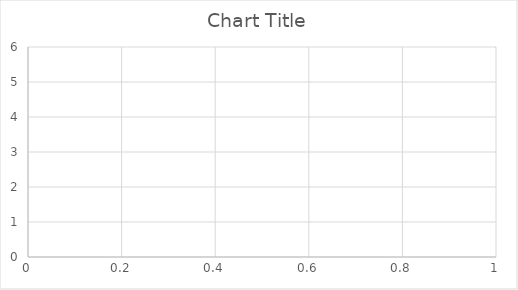
| Category | Series 0 |
|---|---|
| 0 | 6 |
| 1 | 3.5 |
| 2 | 4 |
| 3 | 4.25 |
| 4 | 4.2 |
| 5 | 4.5 |
| 6 | 4 |
| 7 | 4.25 |
| 8 | 4.444 |
| 9 | 4.5 |
| 10 | 4.273 |
| 11 | 4.417 |
| 12 | 4.385 |
| 13 | 4.357 |
| 14 | 4.267 |
| 15 | 4.062 |
| 16 | 4 |
| 17 | 3.889 |
| 18 | 3.947 |
| 19 | 3.85 |
| 20 | 3.857 |
| 21 | 3.955 |
| 22 | 3.826 |
| 23 | 3.833 |
| 24 | 3.76 |
| 25 | 3.846 |
| 26 | 3.815 |
| 27 | 3.714 |
| 28 | 3.621 |
| 29 | 3.633 |
| 30 | 3.581 |
| 31 | 3.625 |
| 32 | 3.636 |
| 33 | 3.559 |
| 34 | 3.514 |
| 35 | 3.5 |
| 36 | 3.432 |
| 37 | 3.395 |
| 38 | 3.462 |
| 39 | 3.5 |
| 40 | 3.439 |
| 41 | 3.429 |
| 42 | 3.395 |
| 43 | 3.386 |
| 44 | 3.4 |
| 45 | 3.413 |
| 46 | 3.468 |
| 47 | 3.521 |
| 48 | 3.571 |
| 49 | 3.52 |
| 50 | 3.471 |
| 51 | 3.423 |
| 52 | 3.434 |
| 53 | 3.463 |
| 54 | 3.418 |
| 55 | 3.429 |
| 56 | 3.474 |
| 57 | 3.517 |
| 58 | 3.525 |
| 59 | 3.55 |
| 60 | 3.541 |
| 61 | 3.565 |
| 62 | 3.587 |
| 63 | 3.594 |
| 64 | 3.569 |
| 65 | 3.545 |
| 66 | 3.567 |
| 67 | 3.544 |
| 68 | 3.565 |
| 69 | 3.557 |
| 70 | 3.592 |
| 71 | 3.625 |
| 72 | 3.644 |
| 73 | 3.662 |
| 74 | 3.64 |
| 75 | 3.632 |
| 76 | 3.662 |
| 77 | 3.667 |
| 78 | 3.696 |
| 79 | 3.675 |
| 80 | 3.654 |
| 81 | 3.646 |
| 82 | 3.639 |
| 83 | 3.667 |
| 84 | 3.647 |
| 85 | 3.628 |
| 86 | 3.609 |
| 87 | 3.58 |
| 88 | 3.551 |
| 89 | 3.544 |
| 90 | 3.56 |
| 91 | 3.554 |
| 92 | 3.559 |
| 93 | 3.585 |
| 94 | 3.611 |
| 95 | 3.583 |
| 96 | 3.608 |
| 97 | 3.602 |
| 98 | 3.626 |
| 99 | 3.65 |
| 100 | 3.653 |
| 101 | 3.657 |
| 102 | 3.631 |
| 103 | 3.625 |
| 104 | 3.619 |
| 105 | 3.594 |
| 106 | 3.579 |
| 107 | 3.593 |
| 108 | 3.596 |
| 109 | 3.609 |
| 110 | 3.586 |
| 111 | 3.58 |
| 112 | 3.558 |
| 113 | 3.544 |
| 114 | 3.557 |
| 115 | 3.552 |
| 116 | 3.556 |
| 117 | 3.534 |
| 118 | 3.546 |
| 119 | 3.567 |
| 120 | 3.554 |
| 121 | 3.549 |
| 122 | 3.553 |
| 123 | 3.556 |
| 124 | 3.536 |
| 125 | 3.556 |
| 126 | 3.535 |
| 127 | 3.547 |
| 128 | 3.543 |
| 129 | 3.538 |
| 130 | 3.557 |
| 131 | 3.553 |
| 132 | 3.556 |
| 133 | 3.545 |
| 134 | 3.526 |
| 135 | 3.537 |
| 136 | 3.555 |
| 137 | 3.565 |
| 138 | 3.568 |
| 139 | 3.571 |
| 140 | 3.589 |
| 141 | 3.585 |
| 142 | 3.587 |
| 143 | 3.569 |
| 144 | 3.572 |
| 145 | 3.562 |
| 146 | 3.544 |
| 147 | 3.541 |
| 148 | 3.523 |
| 149 | 3.527 |
| 150 | 3.51 |
| 151 | 3.52 |
| 152 | 3.523 |
| 153 | 3.526 |
| 154 | 3.51 |
| 155 | 3.494 |
| 156 | 3.484 |
| 157 | 3.5 |
| 158 | 3.491 |
| 159 | 3.475 |
| 160 | 3.466 |
| 161 | 3.463 |
| 162 | 3.448 |
| 163 | 3.457 |
| 164 | 3.442 |
| 165 | 3.428 |
| 166 | 3.419 |
| 167 | 3.405 |
| 168 | 3.414 |
| 169 | 3.418 |
| 170 | 3.427 |
| 171 | 3.413 |
| 172 | 3.416 |
| 173 | 3.431 |
| 174 | 3.446 |
| 175 | 3.432 |
| 176 | 3.441 |
| 177 | 3.444 |
| 178 | 3.458 |
| 179 | 3.444 |
| 180 | 3.453 |
| 181 | 3.456 |
| 182 | 3.448 |
| 183 | 3.462 |
| 184 | 3.47 |
| 185 | 3.462 |
| 186 | 3.471 |
| 187 | 3.463 |
| 188 | 3.45 |
| 189 | 3.463 |
| 190 | 3.461 |
| 191 | 3.464 |
| 192 | 3.477 |
| 193 | 3.464 |
| 194 | 3.462 |
| 195 | 3.469 |
| 196 | 3.462 |
| 197 | 3.455 |
| 198 | 3.447 |
| 199 | 3.435 |
| 200 | 3.443 |
| 201 | 3.45 |
| 202 | 3.443 |
| 203 | 3.431 |
| 204 | 3.424 |
| 205 | 3.422 |
| 206 | 3.42 |
| 207 | 3.423 |
| 208 | 3.431 |
| 209 | 3.443 |
| 210 | 3.436 |
| 211 | 3.439 |
| 212 | 3.427 |
| 213 | 3.421 |
| 214 | 3.414 |
| 215 | 3.421 |
| 216 | 3.424 |
| 217 | 3.422 |
| 218 | 3.429 |
| 219 | 3.427 |
| 220 | 3.434 |
| 221 | 3.441 |
| 222 | 3.444 |
| 223 | 3.446 |
| 224 | 3.449 |
| 225 | 3.442 |
| 226 | 3.449 |
| 227 | 3.443 |
| 228 | 3.454 |
| 229 | 3.457 |
| 230 | 3.45 |
| 231 | 3.461 |
| 232 | 3.455 |
| 233 | 3.466 |
| 234 | 3.46 |
| 235 | 3.458 |
| 236 | 3.46 |
| 237 | 3.466 |
| 238 | 3.464 |
| 239 | 3.467 |
| 240 | 3.461 |
| 241 | 3.455 |
| 242 | 3.444 |
| 243 | 3.443 |
| 244 | 3.441 |
| 245 | 3.435 |
| 246 | 3.441 |
| 247 | 3.44 |
| 248 | 3.446 |
| 249 | 3.44 |
| 250 | 3.442 |
| 251 | 3.437 |
| 252 | 3.435 |
| 253 | 3.429 |
| 254 | 3.439 |
| 255 | 3.449 |
| 256 | 3.459 |
| 257 | 3.453 |
| 258 | 3.463 |
| 259 | 3.454 |
| 260 | 3.456 |
| 261 | 3.45 |
| 262 | 3.441 |
| 263 | 3.436 |
| 264 | 3.43 |
| 265 | 3.429 |
| 266 | 3.434 |
| 267 | 3.433 |
| 268 | 3.442 |
| 269 | 3.437 |
| 270 | 3.439 |
| 271 | 3.43 |
| 272 | 3.44 |
| 273 | 3.434 |
| 274 | 3.425 |
| 275 | 3.417 |
| 276 | 3.422 |
| 277 | 3.417 |
| 278 | 3.419 |
| 279 | 3.421 |
| 280 | 3.42 |
| 281 | 3.429 |
| 282 | 3.435 |
| 283 | 3.43 |
| 284 | 3.425 |
| 285 | 3.434 |
| 286 | 3.436 |
| 287 | 3.444 |
| 288 | 3.453 |
| 289 | 3.455 |
| 290 | 3.464 |
| 291 | 3.473 |
| 292 | 3.471 |
| 293 | 3.476 |
| 294 | 3.478 |
| 295 | 3.473 |
| 296 | 3.468 |
| 297 | 3.47 |
| 298 | 3.472 |
| 299 | 3.47 |
| 300 | 3.465 |
| 301 | 3.474 |
| 302 | 3.475 |
| 303 | 3.477 |
| 304 | 3.472 |
| 305 | 3.477 |
| 306 | 3.485 |
| 307 | 3.494 |
| 308 | 3.492 |
| 309 | 3.484 |
| 310 | 3.482 |
| 311 | 3.481 |
| 312 | 3.479 |
| 313 | 3.478 |
| 314 | 3.476 |
| 315 | 3.475 |
| 316 | 3.47 |
| 317 | 3.462 |
| 318 | 3.461 |
| 319 | 3.466 |
| 320 | 3.47 |
| 321 | 3.463 |
| 322 | 3.471 |
| 323 | 3.466 |
| 324 | 3.465 |
| 325 | 3.469 |
| 326 | 3.474 |
| 327 | 3.482 |
| 328 | 3.486 |
| 329 | 3.485 |
| 330 | 3.486 |
| 331 | 3.482 |
| 332 | 3.477 |
| 333 | 3.476 |
| 334 | 3.481 |
| 335 | 3.482 |
| 336 | 3.49 |
| 337 | 3.497 |
| 338 | 3.496 |
| 339 | 3.5 |
| 340 | 3.496 |
| 341 | 3.503 |
| 342 | 3.51 |
| 343 | 3.509 |
| 344 | 3.504 |
| 345 | 3.512 |
| 346 | 3.516 |
| 347 | 3.52 |
| 348 | 3.527 |
| 349 | 3.531 |
| 350 | 3.527 |
| 351 | 3.528 |
| 352 | 3.527 |
| 353 | 3.534 |
| 354 | 3.532 |
| 355 | 3.531 |
| 356 | 3.527 |
| 357 | 3.528 |
| 358 | 3.532 |
| 359 | 3.539 |
| 360 | 3.535 |
| 361 | 3.536 |
| 362 | 3.529 |
| 363 | 3.522 |
| 364 | 3.521 |
| 365 | 3.525 |
| 366 | 3.529 |
| 367 | 3.533 |
| 368 | 3.528 |
| 369 | 3.53 |
| 370 | 3.526 |
| 371 | 3.53 |
| 372 | 3.531 |
| 373 | 3.532 |
| 374 | 3.525 |
| 375 | 3.529 |
| 376 | 3.523 |
| 377 | 3.526 |
| 378 | 3.528 |
| 379 | 3.526 |
| 380 | 3.533 |
| 381 | 3.539 |
| 382 | 3.538 |
| 383 | 3.539 |
| 384 | 3.545 |
| 385 | 3.539 |
| 386 | 3.545 |
| 387 | 3.544 |
| 388 | 3.542 |
| 389 | 3.541 |
| 390 | 3.545 |
| 391 | 3.538 |
| 392 | 3.545 |
| 393 | 3.551 |
| 394 | 3.554 |
| 395 | 3.553 |
| 396 | 3.557 |
| 397 | 3.555 |
| 398 | 3.559 |
| 399 | 3.555 |
| 400 | 3.554 |
| 401 | 3.55 |
| 402 | 3.553 |
| 403 | 3.547 |
| 404 | 3.541 |
| 405 | 3.537 |
| 406 | 3.531 |
| 407 | 3.527 |
| 408 | 3.523 |
| 409 | 3.52 |
| 410 | 3.523 |
| 411 | 3.529 |
| 412 | 3.523 |
| 413 | 3.524 |
| 414 | 3.528 |
| 415 | 3.529 |
| 416 | 3.53 |
| 417 | 3.524 |
| 418 | 3.525 |
| 419 | 3.521 |
| 420 | 3.515 |
| 421 | 3.509 |
| 422 | 3.506 |
| 423 | 3.5 |
| 424 | 3.501 |
| 425 | 3.505 |
| 426 | 3.508 |
| 427 | 3.507 |
| 428 | 3.513 |
| 429 | 3.509 |
| 430 | 3.515 |
| 431 | 3.519 |
| 432 | 3.522 |
| 433 | 3.518 |
| 434 | 3.515 |
| 435 | 3.509 |
| 436 | 3.508 |
| 437 | 3.505 |
| 438 | 3.503 |
| 439 | 3.507 |
| 440 | 3.51 |
| 441 | 3.507 |
| 442 | 3.506 |
| 443 | 3.505 |
| 444 | 3.503 |
| 445 | 3.509 |
| 446 | 3.512 |
| 447 | 3.516 |
| 448 | 3.521 |
| 449 | 3.527 |
| 450 | 3.523 |
| 451 | 3.529 |
| 452 | 3.532 |
| 453 | 3.537 |
| 454 | 3.541 |
| 455 | 3.542 |
| 456 | 3.536 |
| 457 | 3.531 |
| 458 | 3.525 |
| 459 | 3.52 |
| 460 | 3.516 |
| 461 | 3.511 |
| 462 | 3.505 |
| 463 | 3.502 |
| 464 | 3.505 |
| 465 | 3.502 |
| 466 | 3.497 |
| 467 | 3.494 |
| 468 | 3.495 |
| 469 | 3.489 |
| 470 | 3.49 |
| 471 | 3.494 |
| 472 | 3.497 |
| 473 | 3.5 |
| 474 | 3.503 |
| 475 | 3.508 |
| 476 | 3.512 |
| 477 | 3.517 |
| 478 | 3.511 |
| 479 | 3.51 |
| 480 | 3.514 |
| 481 | 3.517 |
| 482 | 3.518 |
| 483 | 3.523 |
| 484 | 3.522 |
| 485 | 3.516 |
| 486 | 3.511 |
| 487 | 3.506 |
| 488 | 3.511 |
| 489 | 3.506 |
| 490 | 3.511 |
| 491 | 3.514 |
| 492 | 3.511 |
| 493 | 3.506 |
| 494 | 3.509 |
| 495 | 3.512 |
| 496 | 3.511 |
| 497 | 3.514 |
| 498 | 3.511 |
| 499 | 3.51 |
| 500 | 3.509 |
| 501 | 3.512 |
| 502 | 3.513 |
| 503 | 3.518 |
| 504 | 3.523 |
| 505 | 3.522 |
| 506 | 3.521 |
| 507 | 3.522 |
| 508 | 3.525 |
| 509 | 3.525 |
| 510 | 3.523 |
| 511 | 3.525 |
| 512 | 3.528 |
| 513 | 3.531 |
| 514 | 3.532 |
| 515 | 3.533 |
| 516 | 3.534 |
| 517 | 3.531 |
| 518 | 3.536 |
| 519 | 3.531 |
| 520 | 3.536 |
| 521 | 3.54 |
| 522 | 3.541 |
| 523 | 3.538 |
| 524 | 3.543 |
| 525 | 3.544 |
| 526 | 3.541 |
| 527 | 3.538 |
| 528 | 3.537 |
| 529 | 3.532 |
| 530 | 3.535 |
| 531 | 3.53 |
| 532 | 3.525 |
| 533 | 3.53 |
| 534 | 3.529 |
| 535 | 3.532 |
| 536 | 3.527 |
| 537 | 3.524 |
| 538 | 3.519 |
| 539 | 3.517 |
| 540 | 3.514 |
| 541 | 3.518 |
| 542 | 3.519 |
| 543 | 3.52 |
| 544 | 3.523 |
| 545 | 3.524 |
| 546 | 3.523 |
| 547 | 3.52 |
| 548 | 3.523 |
| 549 | 3.527 |
| 550 | 3.528 |
| 551 | 3.524 |
| 552 | 3.526 |
| 553 | 3.527 |
| 554 | 3.526 |
| 555 | 3.525 |
| 556 | 3.528 |
| 557 | 3.53 |
| 558 | 3.535 |
| 559 | 3.532 |
| 560 | 3.528 |
| 561 | 3.523 |
| 562 | 3.526 |
| 563 | 3.523 |
| 564 | 3.526 |
| 565 | 3.527 |
| 566 | 3.527 |
| 567 | 3.526 |
| 568 | 3.527 |
| 569 | 3.532 |
| 570 | 3.527 |
| 571 | 3.528 |
| 572 | 3.531 |
| 573 | 3.528 |
| 574 | 3.53 |
| 575 | 3.526 |
| 576 | 3.53 |
| 577 | 3.526 |
| 578 | 3.53 |
| 579 | 3.533 |
| 580 | 3.532 |
| 581 | 3.529 |
| 582 | 3.528 |
| 583 | 3.529 |
| 584 | 3.533 |
| 585 | 3.531 |
| 586 | 3.533 |
| 587 | 3.531 |
| 588 | 3.528 |
| 589 | 3.525 |
| 590 | 3.523 |
| 591 | 3.527 |
| 592 | 3.53 |
| 593 | 3.527 |
| 594 | 3.531 |
| 595 | 3.532 |
| 596 | 3.528 |
| 597 | 3.53 |
| 598 | 3.528 |
| 599 | 3.527 |
| 600 | 3.529 |
| 601 | 3.53 |
| 602 | 3.529 |
| 603 | 3.53 |
| 604 | 3.534 |
| 605 | 3.535 |
| 606 | 3.534 |
| 607 | 3.531 |
| 608 | 3.527 |
| 609 | 3.526 |
| 610 | 3.522 |
| 611 | 3.523 |
| 612 | 3.52 |
| 613 | 3.524 |
| 614 | 3.522 |
| 615 | 3.519 |
| 616 | 3.52 |
| 617 | 3.516 |
| 618 | 3.514 |
| 619 | 3.513 |
| 620 | 3.509 |
| 621 | 3.51 |
| 622 | 3.512 |
| 623 | 3.513 |
| 624 | 3.514 |
| 625 | 3.511 |
| 626 | 3.507 |
| 627 | 3.505 |
| 628 | 3.502 |
| 629 | 3.503 |
| 630 | 3.507 |
| 631 | 3.503 |
| 632 | 3.506 |
| 633 | 3.503 |
| 634 | 3.507 |
| 635 | 3.503 |
| 636 | 3.499 |
| 637 | 3.497 |
| 638 | 3.499 |
| 639 | 3.497 |
| 640 | 3.496 |
| 641 | 3.494 |
| 642 | 3.495 |
| 643 | 3.498 |
| 644 | 3.499 |
| 645 | 3.495 |
| 646 | 3.491 |
| 647 | 3.491 |
| 648 | 3.488 |
| 649 | 3.489 |
| 650 | 3.485 |
| 651 | 3.489 |
| 652 | 3.493 |
| 653 | 3.494 |
| 654 | 3.493 |
| 655 | 3.492 |
| 656 | 3.49 |
| 657 | 3.486 |
| 658 | 3.484 |
| 659 | 3.48 |
| 660 | 3.48 |
| 661 | 3.483 |
| 662 | 3.481 |
| 663 | 3.485 |
| 664 | 3.487 |
| 665 | 3.489 |
| 666 | 3.49 |
| 667 | 3.487 |
| 668 | 3.487 |
| 669 | 3.488 |
| 670 | 3.49 |
| 671 | 3.491 |
| 672 | 3.495 |
| 673 | 3.494 |
| 674 | 3.493 |
| 675 | 3.49 |
| 676 | 3.489 |
| 677 | 3.491 |
| 678 | 3.493 |
| 679 | 3.494 |
| 680 | 3.496 |
| 681 | 3.5 |
| 682 | 3.501 |
| 683 | 3.501 |
| 684 | 3.505 |
| 685 | 3.509 |
| 686 | 3.507 |
| 687 | 3.506 |
| 688 | 3.507 |
| 689 | 3.507 |
| 690 | 3.507 |
| 691 | 3.509 |
| 692 | 3.508 |
| 693 | 3.51 |
| 694 | 3.511 |
| 695 | 3.51 |
| 696 | 3.508 |
| 697 | 3.506 |
| 698 | 3.502 |
| 699 | 3.506 |
| 700 | 3.509 |
| 701 | 3.513 |
| 702 | 3.514 |
| 703 | 3.517 |
| 704 | 3.515 |
| 705 | 3.518 |
| 706 | 3.515 |
| 707 | 3.516 |
| 708 | 3.519 |
| 709 | 3.515 |
| 710 | 3.519 |
| 711 | 3.522 |
| 712 | 3.523 |
| 713 | 3.525 |
| 714 | 3.522 |
| 715 | 3.522 |
| 716 | 3.519 |
| 717 | 3.521 |
| 718 | 3.52 |
| 719 | 3.522 |
| 720 | 3.523 |
| 721 | 3.525 |
| 722 | 3.528 |
| 723 | 3.53 |
| 724 | 3.532 |
| 725 | 3.529 |
| 726 | 3.53 |
| 727 | 3.532 |
| 728 | 3.534 |
| 729 | 3.537 |
| 730 | 3.54 |
| 731 | 3.54 |
| 732 | 3.539 |
| 733 | 3.541 |
| 734 | 3.543 |
| 735 | 3.546 |
| 736 | 3.547 |
| 737 | 3.546 |
| 738 | 3.547 |
| 739 | 3.55 |
| 740 | 3.553 |
| 741 | 3.553 |
| 742 | 3.549 |
| 743 | 3.551 |
| 744 | 3.549 |
| 745 | 3.55 |
| 746 | 3.55 |
| 747 | 3.553 |
| 748 | 3.553 |
| 749 | 3.556 |
| 750 | 3.553 |
| 751 | 3.552 |
| 752 | 3.548 |
| 753 | 3.545 |
| 754 | 3.543 |
| 755 | 3.545 |
| 756 | 3.546 |
| 757 | 3.545 |
| 758 | 3.547 |
| 759 | 3.545 |
| 760 | 3.545 |
| 761 | 3.545 |
| 762 | 3.548 |
| 763 | 3.547 |
| 764 | 3.545 |
| 765 | 3.548 |
| 766 | 3.55 |
| 767 | 3.551 |
| 768 | 3.554 |
| 769 | 3.557 |
| 770 | 3.56 |
| 771 | 3.56 |
| 772 | 3.559 |
| 773 | 3.562 |
| 774 | 3.559 |
| 775 | 3.562 |
| 776 | 3.561 |
| 777 | 3.563 |
| 778 | 3.56 |
| 779 | 3.563 |
| 780 | 3.561 |
| 781 | 3.563 |
| 782 | 3.559 |
| 783 | 3.562 |
| 784 | 3.563 |
| 785 | 3.56 |
| 786 | 3.559 |
| 787 | 3.56 |
| 788 | 3.558 |
| 789 | 3.557 |
| 790 | 3.555 |
| 791 | 3.553 |
| 792 | 3.551 |
| 793 | 3.554 |
| 794 | 3.553 |
| 795 | 3.554 |
| 796 | 3.556 |
| 797 | 3.555 |
| 798 | 3.552 |
| 799 | 3.551 |
| 800 | 3.551 |
| 801 | 3.551 |
| 802 | 3.552 |
| 803 | 3.549 |
| 804 | 3.55 |
| 805 | 3.55 |
| 806 | 3.548 |
| 807 | 3.546 |
| 808 | 3.545 |
| 809 | 3.542 |
| 810 | 3.543 |
| 811 | 3.544 |
| 812 | 3.546 |
| 813 | 3.543 |
| 814 | 3.54 |
| 815 | 3.537 |
| 816 | 3.537 |
| 817 | 3.534 |
| 818 | 3.536 |
| 819 | 3.535 |
| 820 | 3.538 |
| 821 | 3.539 |
| 822 | 3.542 |
| 823 | 3.541 |
| 824 | 3.539 |
| 825 | 3.538 |
| 826 | 3.534 |
| 827 | 3.533 |
| 828 | 3.536 |
| 829 | 3.539 |
| 830 | 3.542 |
| 831 | 3.542 |
| 832 | 3.543 |
| 833 | 3.543 |
| 834 | 3.546 |
| 835 | 3.549 |
| 836 | 3.547 |
| 837 | 3.545 |
| 838 | 3.544 |
| 839 | 3.54 |
| 840 | 3.54 |
| 841 | 3.538 |
| 842 | 3.536 |
| 843 | 3.533 |
| 844 | 3.536 |
| 845 | 3.535 |
| 846 | 3.532 |
| 847 | 3.534 |
| 848 | 3.536 |
| 849 | 3.536 |
| 850 | 3.536 |
| 851 | 3.534 |
| 852 | 3.533 |
| 853 | 3.533 |
| 854 | 3.533 |
| 855 | 3.533 |
| 856 | 3.531 |
| 857 | 3.529 |
| 858 | 3.532 |
| 859 | 3.529 |
| 860 | 3.532 |
| 861 | 3.531 |
| 862 | 3.528 |
| 863 | 3.531 |
| 864 | 3.531 |
| 865 | 3.531 |
| 866 | 3.533 |
| 867 | 3.536 |
| 868 | 3.534 |
| 869 | 3.536 |
| 870 | 3.538 |
| 871 | 3.539 |
| 872 | 3.537 |
| 873 | 3.535 |
| 874 | 3.533 |
| 875 | 3.535 |
| 876 | 3.538 |
| 877 | 3.541 |
| 878 | 3.54 |
| 879 | 3.539 |
| 880 | 3.537 |
| 881 | 3.539 |
| 882 | 3.537 |
| 883 | 3.536 |
| 884 | 3.533 |
| 885 | 3.534 |
| 886 | 3.532 |
| 887 | 3.534 |
| 888 | 3.535 |
| 889 | 3.534 |
| 890 | 3.536 |
| 891 | 3.537 |
| 892 | 3.535 |
| 893 | 3.532 |
| 894 | 3.532 |
| 895 | 3.535 |
| 896 | 3.535 |
| 897 | 3.535 |
| 898 | 3.536 |
| 899 | 3.537 |
| 900 | 3.539 |
| 901 | 3.542 |
| 902 | 3.545 |
| 903 | 3.544 |
| 904 | 3.547 |
| 905 | 3.55 |
| 906 | 3.547 |
| 907 | 3.548 |
| 908 | 3.546 |
| 909 | 3.543 |
| 910 | 3.543 |
| 911 | 3.542 |
| 912 | 3.54 |
| 913 | 3.54 |
| 914 | 3.543 |
| 915 | 3.545 |
| 916 | 3.543 |
| 917 | 3.544 |
| 918 | 3.541 |
| 919 | 3.539 |
| 920 | 3.536 |
| 921 | 3.534 |
| 922 | 3.532 |
| 923 | 3.534 |
| 924 | 3.533 |
| 925 | 3.531 |
| 926 | 3.531 |
| 927 | 3.529 |
| 928 | 3.526 |
| 929 | 3.524 |
| 930 | 3.522 |
| 931 | 3.523 |
| 932 | 3.523 |
| 933 | 3.524 |
| 934 | 3.521 |
| 935 | 3.519 |
| 936 | 3.517 |
| 937 | 3.514 |
| 938 | 3.511 |
| 939 | 3.512 |
| 940 | 3.513 |
| 941 | 3.514 |
| 942 | 3.512 |
| 943 | 3.513 |
| 944 | 3.51 |
| 945 | 3.511 |
| 946 | 3.511 |
| 947 | 3.514 |
| 948 | 3.512 |
| 949 | 3.514 |
| 950 | 3.511 |
| 951 | 3.511 |
| 952 | 3.513 |
| 953 | 3.515 |
| 954 | 3.515 |
| 955 | 3.514 |
| 956 | 3.513 |
| 957 | 3.514 |
| 958 | 3.511 |
| 959 | 3.512 |
| 960 | 3.51 |
| 961 | 3.507 |
| 962 | 3.506 |
| 963 | 3.503 |
| 964 | 3.503 |
| 965 | 3.505 |
| 966 | 3.503 |
| 967 | 3.503 |
| 968 | 3.503 |
| 969 | 3.501 |
| 970 | 3.504 |
| 971 | 3.505 |
| 972 | 3.506 |
| 973 | 3.505 |
| 974 | 3.507 |
| 975 | 3.509 |
| 976 | 3.508 |
| 977 | 3.505 |
| 978 | 3.504 |
| 979 | 3.502 |
| 980 | 3.502 |
| 981 | 3.504 |
| 982 | 3.506 |
| 983 | 3.507 |
| 984 | 3.505 |
| 985 | 3.502 |
| 986 | 3.501 |
| 987 | 3.5 |
| 988 | 3.501 |
| 989 | 3.499 |
| 990 | 3.501 |
| 991 | 3.5 |
| 992 | 3.497 |
| 993 | 3.495 |
| 994 | 3.496 |
| 995 | 3.495 |
| 996 | 3.496 |
| 997 | 3.497 |
| 998 | 3.495 |
| 999 | 3.493 |